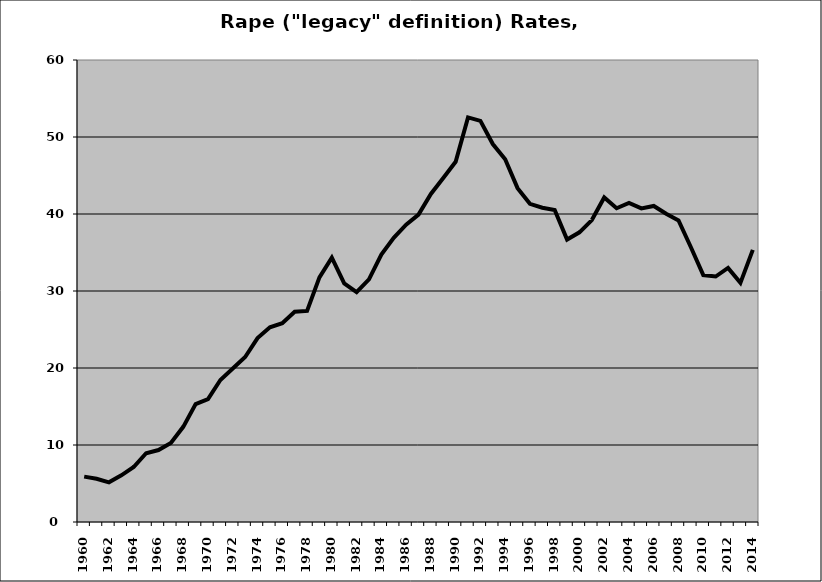
| Category | Rape |
|---|---|
| 1960.0 | 5.893 |
| 1961.0 | 5.61 |
| 1962.0 | 5.15 |
| 1963.0 | 6.065 |
| 1964.0 | 7.139 |
| 1965.0 | 8.931 |
| 1966.0 | 9.345 |
| 1967.0 | 10.26 |
| 1968.0 | 12.36 |
| 1969.0 | 15.317 |
| 1970.0 | 15.959 |
| 1971.0 | 18.445 |
| 1972.0 | 19.93 |
| 1973.0 | 21.424 |
| 1974.0 | 23.889 |
| 1975.0 | 25.29 |
| 1976.0 | 25.809 |
| 1977.0 | 27.297 |
| 1978.0 | 27.417 |
| 1979.0 | 31.768 |
| 1980.0 | 34.328 |
| 1981.0 | 30.986 |
| 1982.0 | 29.867 |
| 1983.0 | 31.519 |
| 1984.0 | 34.728 |
| 1985.0 | 36.914 |
| 1986.0 | 38.607 |
| 1987.0 | 39.92 |
| 1988.0 | 42.605 |
| 1989.0 | 44.669 |
| 1990.0 | 46.787 |
| 1991.0 | 52.546 |
| 1992.0 | 52.097 |
| 1993.0 | 49.085 |
| 1994.0 | 47.118 |
| 1995.0 | 43.359 |
| 1996.0 | 41.323 |
| 1997.0 | 40.819 |
| 1998.0 | 40.53 |
| 1999.0 | 36.681 |
| 2000.0 | 37.62 |
| 2001.0 | 39.211 |
| 2002.0 | 42.152 |
| 2003.0 | 40.743 |
| 2004.0 | 41.432 |
| 2005.0 | 40.721 |
| 2006.0 | 41.044 |
| 2007.0 | 40.028 |
| 2008.0 | 39.157 |
| 2009.0 | 35.685 |
| 2010.0 | 32.063 |
| 2011.0 | 31.878 |
| 2012.0 | 33.004 |
| 2013.0 | 31.058 |
| 2014.0 | 35.337 |